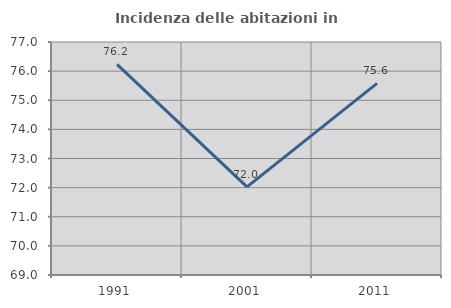
| Category | Incidenza delle abitazioni in proprietà  |
|---|---|
| 1991.0 | 76.231 |
| 2001.0 | 72.026 |
| 2011.0 | 75.578 |